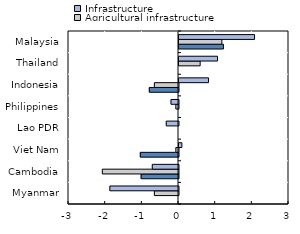
| Category | Agricultural R&D | Agricultural infrastructure | Infrastructure |
|---|---|---|---|
| Myanmar | 0 | -0.658 | -1.872 |
| Cambodia | -1.019 | -2.077 | -0.715 |
| Viet Nam | -1.042 | -0.072 | 0.079 |
| Lao PDR | 0 | 0 | -0.334 |
| Philippines | 0 | -0.072 | -0.205 |
| Indonesia | -0.796 | -0.658 | 0.806 |
| Thailand | 0 | 0.577 | 1.051 |
| Malaysia | 1.212 | 1.169 | 2.06 |